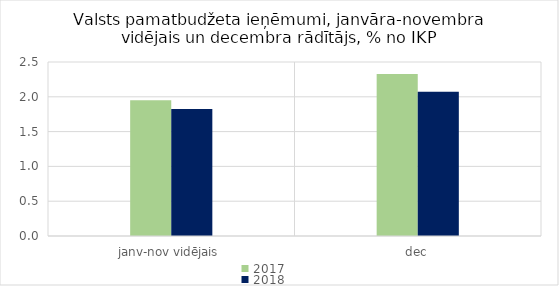
| Category | 2017 | 2018 |
|---|---|---|
| janv-nov vidējais | 1.951 | 1.823 |
| dec | 2.329 | 2.071 |